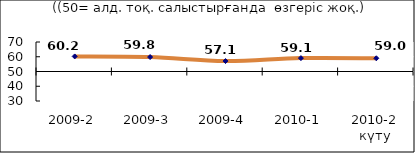
| Category | Диф.индекс ↓ |
|---|---|
| 2009-2 | 60.22 |
| 2009-3 | 59.79 |
| 2009-4 | 57.085 |
| 2010-1 | 59.075 |
| 2010-2 күту | 58.955 |